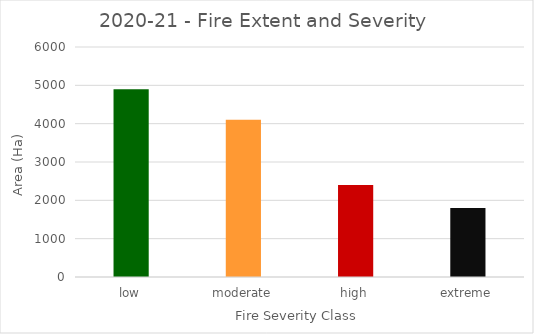
| Category | Series 0 |
|---|---|
| low | 4900 |
| moderate | 4100 |
| high | 2400 |
| extreme | 1800 |